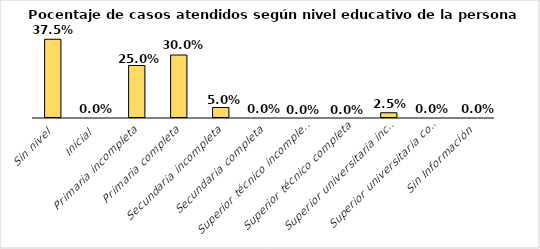
| Category | Series 0 |
|---|---|
| Sin nivel | 0.375 |
| Inicial | 0 |
| Primaria incompleta | 0.25 |
| Primaria completa | 0.3 |
| Secundaria incompleta | 0.05 |
| Secundaria completa | 0 |
| Superior técnico incompleta | 0 |
| Superior técnico completa | 0 |
| Superior universitaria incompleta | 0.025 |
| Superior universitaria completo | 0 |
| Sin Información | 0 |